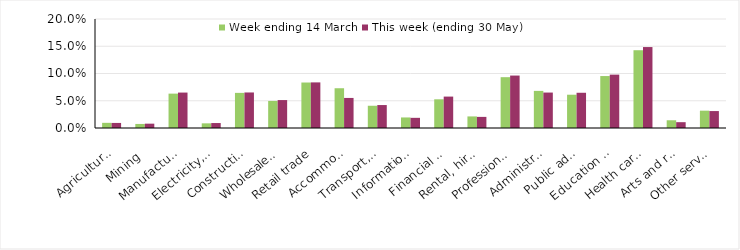
| Category | Week ending 14 March | This week (ending 30 May) |
|---|---|---|
| Agriculture, forestry and fishing | 0.009 | 0.009 |
| Mining | 0.007 | 0.008 |
| Manufacturing | 0.063 | 0.065 |
| Electricity, gas, water and waste services | 0.009 | 0.009 |
| Construction | 0.064 | 0.065 |
| Wholesale trade | 0.05 | 0.051 |
| Retail trade | 0.083 | 0.084 |
| Accommodation and food services | 0.073 | 0.055 |
| Transport, postal and warehousing | 0.041 | 0.042 |
| Information media and telecommunications | 0.019 | 0.019 |
| Financial and insurance services | 0.053 | 0.058 |
| Rental, hiring and real estate services | 0.021 | 0.02 |
| Professional, scientific and technical services | 0.093 | 0.096 |
| Administrative and support services | 0.068 | 0.065 |
| Public administration and safety | 0.061 | 0.065 |
| Education and training | 0.095 | 0.098 |
| Health care and social assistance | 0.143 | 0.149 |
| Arts and recreation services | 0.014 | 0.011 |
| Other services | 0.032 | 0.031 |